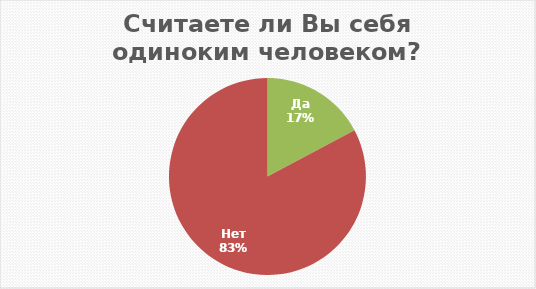
| Category | Итог |
|---|---|
| Да | 146 |
| Нет | 702 |